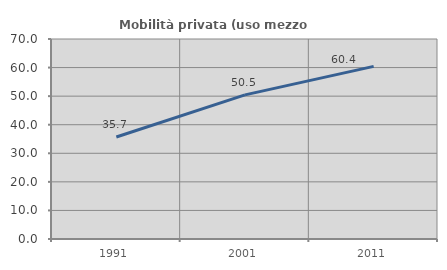
| Category | Mobilità privata (uso mezzo privato) |
|---|---|
| 1991.0 | 35.708 |
| 2001.0 | 50.452 |
| 2011.0 | 60.416 |